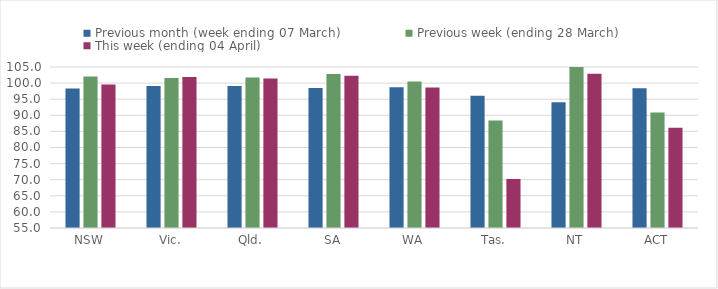
| Category | Previous month (week ending 07 March) | Previous week (ending 28 March) | This week (ending 04 April) |
|---|---|---|---|
| NSW | 98.298 | 102.06 | 99.532 |
| Vic. | 99.116 | 101.549 | 101.866 |
| Qld. | 99.074 | 101.774 | 101.431 |
| SA | 98.468 | 102.86 | 102.3 |
| WA | 98.684 | 100.526 | 98.653 |
| Tas. | 96.052 | 88.348 | 70.234 |
| NT | 94.07 | 106.333 | 102.918 |
| ACT | 98.413 | 90.845 | 86.097 |